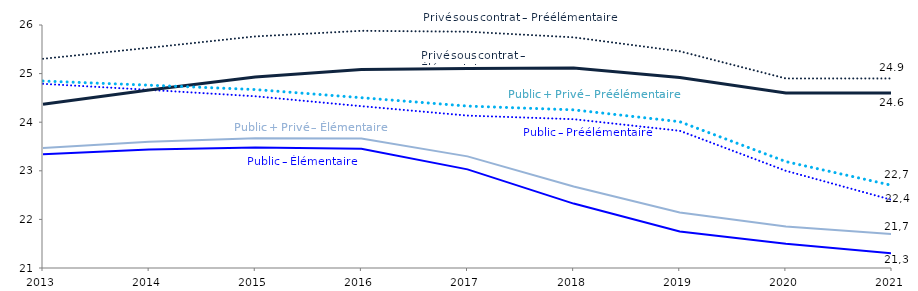
| Category | Public - Préélémentaire | Public - Élémentaire | Privé sous contrat - Préélémentaire | Privé sous contrat - Élémentaire | Public + Privé - Préélémentaire | Public + Privé - Élémentaire |
|---|---|---|---|---|---|---|
| 2013.0 | 24.789 | 23.339 | 25.305 | 24.368 | 24.847 | 23.471 |
| 2014.0 | 24.666 | 23.44 | 25.531 | 24.664 | 24.762 | 23.597 |
| 2015.0 | 24.533 | 23.482 | 25.765 | 24.929 | 24.672 | 23.67 |
| 2016.0 | 24.33 | 23.452 | 25.88 | 25.084 | 24.504 | 23.663 |
| 2017.0 | 24.136 | 23.029 | 25.862 | 25.104 | 24.332 | 23.297 |
| 2018.0 | 24.062 | 22.325 | 25.746 | 25.114 | 24.254 | 22.676 |
| 2019.0 | 23.824 | 21.749 | 25.46 | 24.918 | 24.01 | 22.141 |
| 2020.0 | 23 | 21.5 | 24.9 | 24.6 | 23.19 | 21.855 |
| 2021.0 | 22.4 | 21.3 | 24.9 | 24.6 | 22.7 | 21.7 |